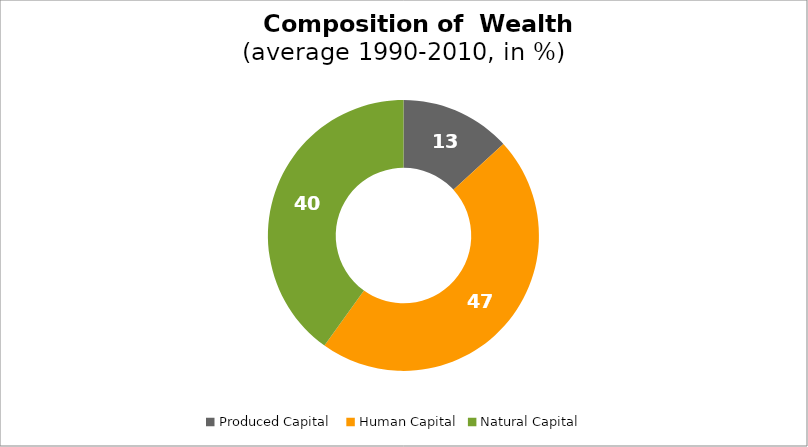
| Category | Series 0 |
|---|---|
| Produced Capital  | 13.185 |
| Human Capital | 46.729 |
| Natural Capital | 40.087 |